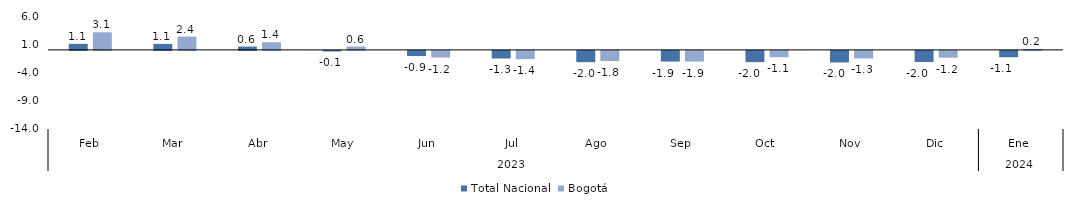
| Category | Total Nacional | Bogotá |
|---|---|---|
| 0 | 1.077 | 3.113 |
| 1 | 1.067 | 2.357 |
| 2 | 0.586 | 1.353 |
| 3 | -0.103 | 0.601 |
| 4 | -0.909 | -1.175 |
| 5 | -1.341 | -1.45 |
| 6 | -1.997 | -1.794 |
| 7 | -1.885 | -1.888 |
| 8 | -1.991 | -1.115 |
| 9 | -2.048 | -1.344 |
| 10 | -1.969 | -1.202 |
| 11 | -1.119 | 0.176 |